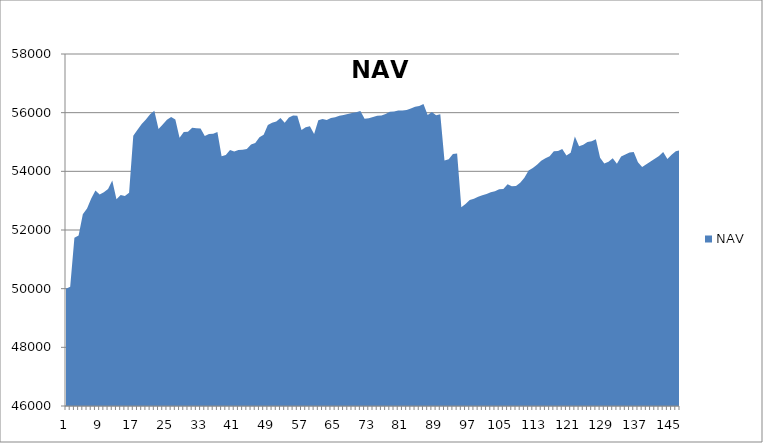
| Category | NAV |
|---|---|
| 0 | 50000 |
| 1 | 50069.444 |
| 2 | 51736.444 |
| 3 | 51809.343 |
| 4 | 52539.343 |
| 5 | 52733.57 |
| 6 | 53070.527 |
| 7 | 53346.212 |
| 8 | 53210.13 |
| 9 | 53285.788 |
| 10 | 53396.685 |
| 11 | 53684.185 |
| 12 | 53050.597 |
| 13 | 53191.058 |
| 14 | 53162.649 |
| 15 | 53270.317 |
| 16 | 55214.762 |
| 17 | 55418.583 |
| 18 | 55617.273 |
| 19 | 55770.477 |
| 20 | 55945.477 |
| 21 | 56069.601 |
| 22 | 55444.601 |
| 23 | 55597.925 |
| 24 | 55757.558 |
| 25 | 55851.308 |
| 26 | 55764.06 |
| 27 | 55148.361 |
| 28 | 55340.028 |
| 29 | 55349.317 |
| 30 | 55485.393 |
| 31 | 55468.704 |
| 32 | 55461.038 |
| 33 | 55205.356 |
| 34 | 55270.356 |
| 35 | 55282.57 |
| 36 | 55341.011 |
| 37 | 54517.482 |
| 38 | 54554.291 |
| 39 | 54731.016 |
| 40 | 54679.093 |
| 41 | 54730.595 |
| 42 | 54736.73 |
| 43 | 54765.085 |
| 44 | 54915.643 |
| 45 | 54969.86 |
| 46 | 55164.665 |
| 47 | 55247.746 |
| 48 | 55575.668 |
| 49 | 55657.905 |
| 50 | 55701.032 |
| 51 | 55819.28 |
| 52 | 55652.834 |
| 53 | 55838.604 |
| 54 | 55905.769 |
| 55 | 55898.888 |
| 56 | 55410.9 |
| 57 | 55504.564 |
| 58 | 55537.603 |
| 59 | 55268.471 |
| 60 | 55737.858 |
| 61 | 55785.708 |
| 62 | 55749.829 |
| 63 | 55815.591 |
| 64 | 55842.34 |
| 65 | 55894.021 |
| 66 | 55916.828 |
| 67 | 55955.697 |
| 68 | 55991.896 |
| 69 | 56012.065 |
| 70 | 56060.293 |
| 71 | 55791.443 |
| 72 | 55810.674 |
| 73 | 55852.843 |
| 74 | 55892.018 |
| 75 | 55900.069 |
| 76 | 55955.739 |
| 77 | 56030.918 |
| 78 | 56036.168 |
| 79 | 56069.975 |
| 80 | 56071.656 |
| 81 | 56090.406 |
| 82 | 56141.798 |
| 83 | 56199.159 |
| 84 | 56228.237 |
| 85 | 56292.573 |
| 86 | 55924.369 |
| 87 | 56019.106 |
| 88 | 55916.165 |
| 89 | 55950.09 |
| 90 | 54367.13 |
| 91 | 54411.811 |
| 92 | 54588.933 |
| 93 | 54611.197 |
| 94 | 52777.117 |
| 95 | 52883.107 |
| 96 | 53025.651 |
| 97 | 53064.908 |
| 98 | 53135.652 |
| 99 | 53186.005 |
| 100 | 53229.789 |
| 101 | 53290.192 |
| 102 | 53319.038 |
| 103 | 53392.112 |
| 104 | 53401.462 |
| 105 | 53559.878 |
| 106 | 53489.526 |
| 107 | 53501.684 |
| 108 | 53607.597 |
| 109 | 53785.178 |
| 110 | 54030.211 |
| 111 | 54113.452 |
| 112 | 54226.272 |
| 113 | 54358.625 |
| 114 | 54444.736 |
| 115 | 54518.421 |
| 116 | 54681.882 |
| 117 | 54693.454 |
| 118 | 54759.719 |
| 119 | 54542.637 |
| 120 | 54631.804 |
| 121 | 55189.582 |
| 122 | 54857.283 |
| 123 | 54902.45 |
| 124 | 54998.878 |
| 125 | 55024.352 |
| 126 | 55097.595 |
| 127 | 54460.788 |
| 128 | 54265.386 |
| 129 | 54330.201 |
| 130 | 54444.032 |
| 131 | 54258.967 |
| 132 | 54502.531 |
| 133 | 54576.689 |
| 134 | 54645.616 |
| 135 | 54655.645 |
| 136 | 54306.491 |
| 137 | 54146.917 |
| 138 | 54245.601 |
| 139 | 54336.218 |
| 140 | 54425.943 |
| 141 | 54524.223 |
| 142 | 54658.516 |
| 143 | 54423.271 |
| 144 | 54567.668 |
| 145 | 54687.668 |
| 146 | 54715.668 |